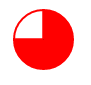
| Category | Series 0 |
|---|---|
| 0 | 75 |
| 1 | 25 |